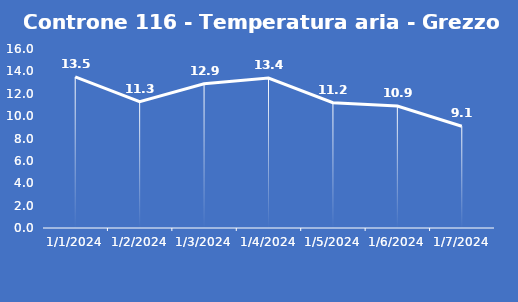
| Category | Controne 116 - Temperatura aria - Grezzo (°C) |
|---|---|
| 1/1/24 | 13.5 |
| 1/2/24 | 11.3 |
| 1/3/24 | 12.9 |
| 1/4/24 | 13.4 |
| 1/5/24 | 11.2 |
| 1/6/24 | 10.9 |
| 1/7/24 | 9.1 |